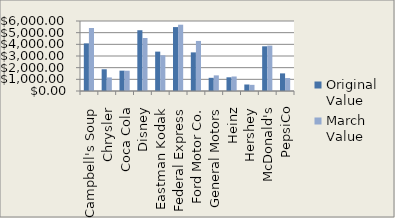
| Category | Original Value | March Value |
|---|---|---|
| Campbell's Soup | 4080 | 5400 |
| Chrysler | 1862.5 | 1162.5 |
| Coca Cola | 1743.75 | 1737.5 |
| Disney | 5208.45 | 4542.2 |
| Eastman Kodak | 3375 | 3062.5 |
| Federal Express | 5479.2 | 5681.7 |
| Ford Motor Co. | 3310.4 | 4290.4 |
| General Motors | 1130 | 1340 |
| Heinz | 1175 | 1243.75 |
| Hershey | 557.5 | 527.5 |
| McDonald's | 3830.4 | 3890.4 |
| PepsiCo | 1510 | 1110 |